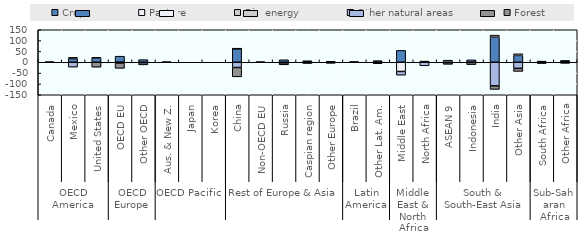
| Category | Crops | Pasture | Bio-energy | Other natural areas | Forest |
|---|---|---|---|---|---|
| 0 | 0.219 | -0.188 | 0 | 0 | 0 |
| 1 | 17163.125 | 5295.062 | 0 | -22458.5 | 0 |
| 2 | 19650.5 | 3092.75 | 0 | 0 | -22743.5 |
| 3 | 28002.5 | -993.156 | 0 | -2486.844 | -24522.5 |
| 4 | 12113.703 | -2545 | 0 | -9568.812 | 0 |
| 5 | 16.469 | -16.25 | 0 | 0 | 0 |
| 6 | 0 | 0 | 0 | 0 | 0 |
| 7 | 0 | 0 | 0 | 0 | 0 |
| 8 | 62604 | 9.25 | 0 | -24250.75 | -42994.5 |
| 9 | 16.266 | -16.281 | 0 | 0 | 0 |
| 10 | 11682.625 | -2260.812 | 0 | -684.75 | -8738 |
| 11 | -5781.188 | 3838.5 | 0 | 1943 | 0 |
| 12 | 2312.5 | 1514.156 | 0 | -2075.398 | -1751.25 |
| 13 | 2 | -1.875 | 0 | 0 | -0.25 |
| 14 | 3919.5 | -3973.25 | 0 | -2644.5 | 2698.25 |
| 15 | 54829.906 | -42457.5 | 0 | -17113.125 | 0 |
| 16 | 3047.078 | 199.312 | 0 | -16374.883 | 0 |
| 17 | -2156.375 | -1.625 | 0 | 9564.531 | -7406.625 |
| 18 | 11094 | -1291.406 | 0 | 0 | -9802.312 |
| 19 | 115781.25 | 9505.5 | 0 | -108988.938 | -16297.25 |
| 20 | 31616.562 | 7606.375 | 0 | -28073.062 | -13984.875 |
| 21 | 1858.453 | 3475.375 | 0 | -2672.875 | -2660.875 |
| 22 | 4776.75 | -5519 | 0 | 118.75 | 629 |